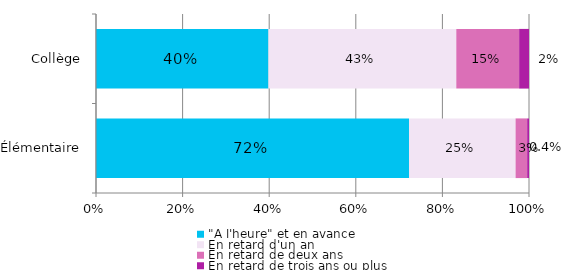
| Category | "A l'heure" et en avance | En retard d'un an | En retard de deux ans | En retard de trois ans ou plus |
|---|---|---|---|---|
| Élémentaire | 0.723 | 0.246 | 0.027 | 0.004 |
| Collège | 0.398 | 0.434 | 0.145 | 0.023 |